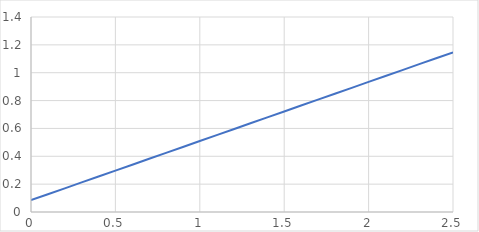
| Category | Series 0 |
|---|---|
| 0.0 | 0.085 |
| 0.1 | 0.127 |
| 0.2 | 0.17 |
| 0.30000000000000004 | 0.212 |
| 0.4 | 0.255 |
| 0.5 | 0.297 |
| 0.6 | 0.34 |
| 0.7 | 0.382 |
| 0.7999999999999999 | 0.425 |
| 0.8999999999999999 | 0.467 |
| 0.9999999999999999 | 0.509 |
| 1.0999999999999999 | 0.552 |
| 1.2 | 0.594 |
| 1.3 | 0.637 |
| 1.4000000000000001 | 0.679 |
| 1.5000000000000002 | 0.722 |
| 1.6000000000000003 | 0.764 |
| 1.7000000000000004 | 0.807 |
| 1.8000000000000005 | 0.849 |
| 1.9000000000000006 | 0.892 |
| 2.0000000000000004 | 0.934 |
| 2.1000000000000005 | 0.976 |
| 2.2000000000000006 | 1.019 |
| 2.3000000000000007 | 1.061 |
| 2.400000000000001 | 1.104 |
| 2.500000000000001 | 1.146 |